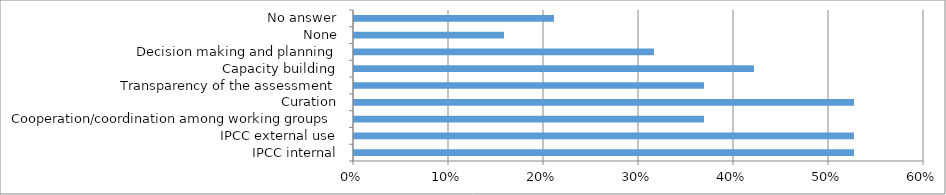
| Category | Series 0 |
|---|---|
| IPCC internal | 0.526 |
| IPCC external use | 0.526 |
| Cooperation/coordination among working groups | 0.368 |
| Curation | 0.526 |
| Transparency of the assessment | 0.368 |
| Capacity building | 0.421 |
| Decision making and planning | 0.316 |
| None | 0.158 |
| No answer | 0.211 |